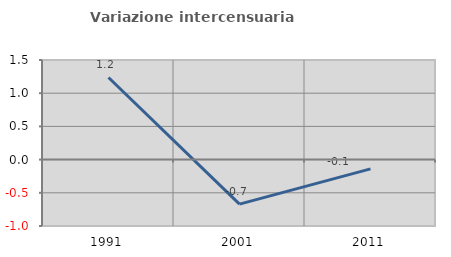
| Category | Variazione intercensuaria annua |
|---|---|
| 1991.0 | 1.237 |
| 2001.0 | -0.67 |
| 2011.0 | -0.14 |